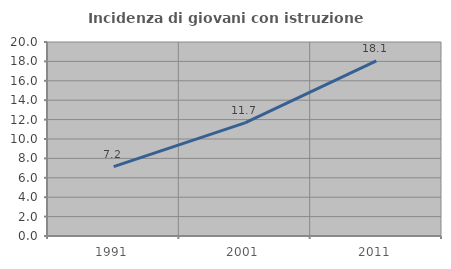
| Category | Incidenza di giovani con istruzione universitaria |
|---|---|
| 1991.0 | 7.158 |
| 2001.0 | 11.667 |
| 2011.0 | 18.064 |